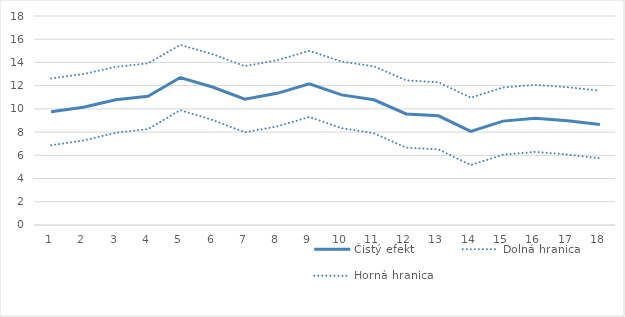
| Category | Čistý efekt | Dolná hranica | Horná hranica |
|---|---|---|---|
| 1.0 | 9.749 | 6.874 | 12.625 |
| 2.0 | 10.136 | 7.272 | 13 |
| 3.0 | 10.781 | 7.944 | 13.618 |
| 4.0 | 11.089 | 8.255 | 13.924 |
| 5.0 | 12.701 | 9.891 | 15.511 |
| 6.0 | 11.882 | 9.048 | 14.715 |
| 7.0 | 10.83 | 7.98 | 13.68 |
| 8.0 | 11.339 | 8.49 | 14.189 |
| 9.0 | 12.153 | 9.307 | 14.998 |
| 10.0 | 11.207 | 8.34 | 14.073 |
| 11.0 | 10.784 | 7.901 | 13.666 |
| 12.0 | 9.561 | 6.666 | 12.456 |
| 13.0 | 9.402 | 6.512 | 12.292 |
| 14.0 | 8.06 | 5.161 | 10.96 |
| 15.0 | 8.948 | 6.053 | 11.842 |
| 16.0 | 9.184 | 6.298 | 12.07 |
| 17.0 | 8.97 | 6.072 | 11.867 |
| 18.0 | 8.655 | 5.745 | 11.564 |